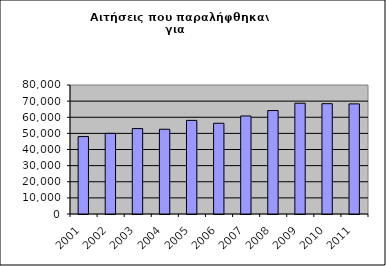
| Category | Series 1 |
|---|---|
| 2001.0 | 48010 |
| 2002.0 | 49998 |
| 2003.0 | 52964 |
| 2004.0 | 52551 |
| 2005.0 | 58046 |
| 2006.0 | 56263 |
| 2007.0 | 60792 |
| 2008.0 | 64163 |
| 2009.0 | 68694 |
| 2010.0 | 68418 |
| 2011.0 | 68292 |